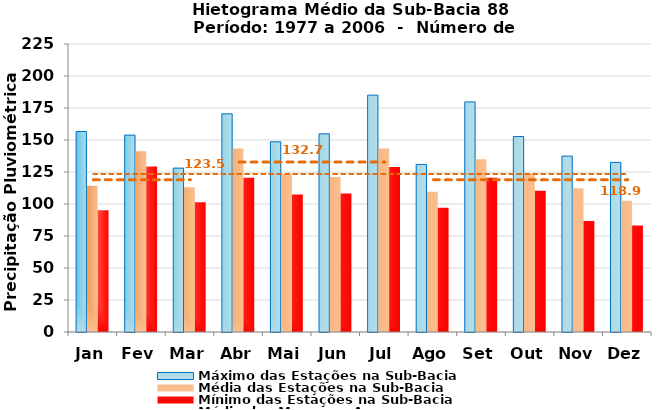
| Category | Máximo das Estações na Sub-Bacia | Média das Estações na Sub-Bacia | Mínimo das Estações na Sub-Bacia |
|---|---|---|---|
| Jan | 156.633 | 114.261 | 95.023 |
| Fev | 153.81 | 141.157 | 129.386 |
| Mar | 128.03 | 112.99 | 101.333 |
| Abr | 170.473 | 143.264 | 120.58 |
| Mai | 148.58 | 123.234 | 107.36 |
| Jun | 154.83 | 121.097 | 108.12 |
| Jul | 185.05 | 143.4 | 128.852 |
| Ago | 130.94 | 109.518 | 97.086 |
| Set | 179.77 | 134.879 | 120.576 |
| Out | 152.68 | 123.61 | 110.41 |
| Nov | 137.407 | 112.237 | 86.667 |
| Dez | 132.53 | 102.579 | 83.233 |